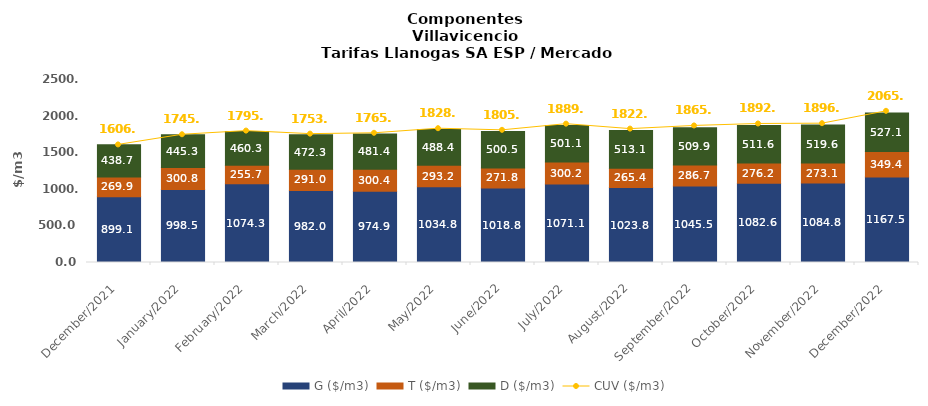
| Category | G ($/m3) | T ($/m3) | D ($/m3) |
|---|---|---|---|
| 2021-12-01 | 899.1 | 269.91 | 438.66 |
| 2022-01-01 | 998.53 | 300.84 | 445.28 |
| 2022-02-01 | 1074.31 | 255.71 | 460.33 |
| 2022-03-01 | 981.99 | 290.95 | 472.3 |
| 2022-04-01 | 974.88 | 300.4 | 481.41 |
| 2022-05-01 | 1034.82 | 293.23 | 488.41 |
| 2022-06-01 | 1018.78 | 271.84 | 500.5 |
| 2022-07-01 | 1071.1 | 300.23 | 501.07 |
| 2022-08-01 | 1023.83 | 265.35 | 513.09 |
| 2022-09-01 | 1045.5 | 286.69 | 509.94 |
| 2022-10-01 | 1082.55 | 276.23 | 511.58 |
| 2022-11-01 | 1084.79 | 273.13 | 519.57 |
| 2022-12-01 | 1167.54 | 349.4 | 527.09 |